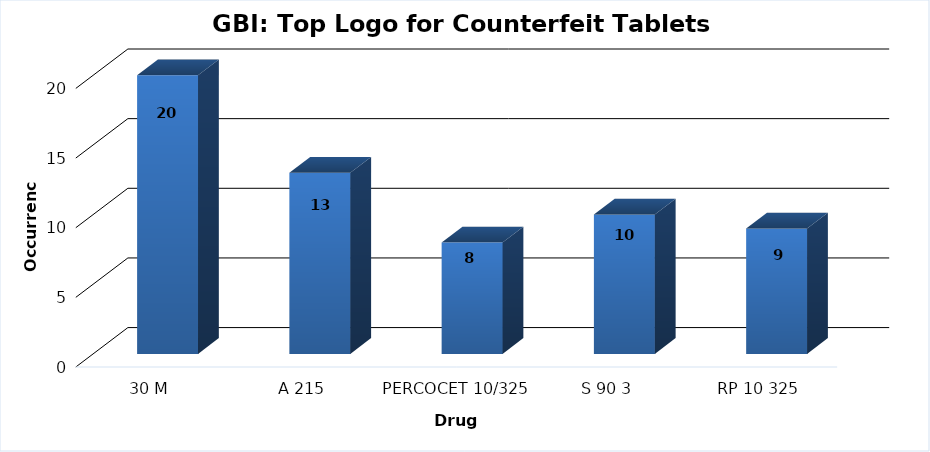
| Category | Series 0 |
|---|---|
| 30 M | 20 |
| A 215 | 13 |
| PERCOCET 10/325 | 8 |
| S 90 3 | 10 |
| RP 10 325 | 9 |